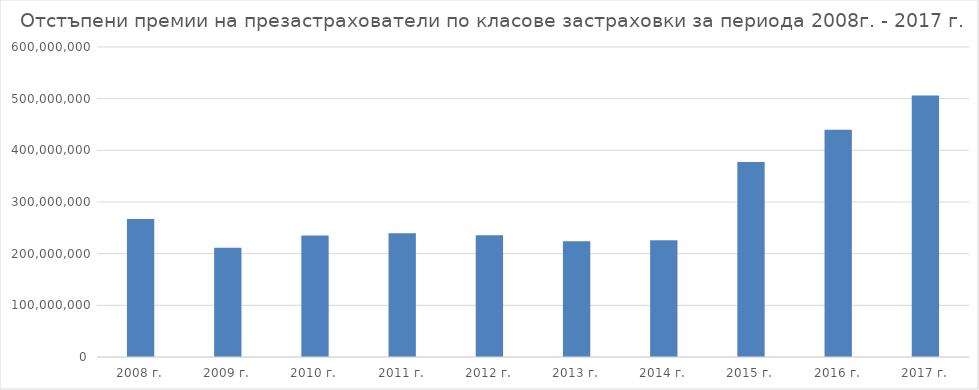
| Category | Series 0 |
|---|---|
| 2008 г. | 267014465.243 |
| 2009 г. | 211607008.844 |
| 2010 г. | 235369864.249 |
| 2011 г. | 239630505.177 |
| 2012 г. | 235585203.769 |
| 2013 г. | 224010693.226 |
| 2014 г. | 225803248.762 |
| 2015 г. | 377411422.386 |
| 2016 г. | 439683141.844 |
| 2017 г. | 506089881.084 |